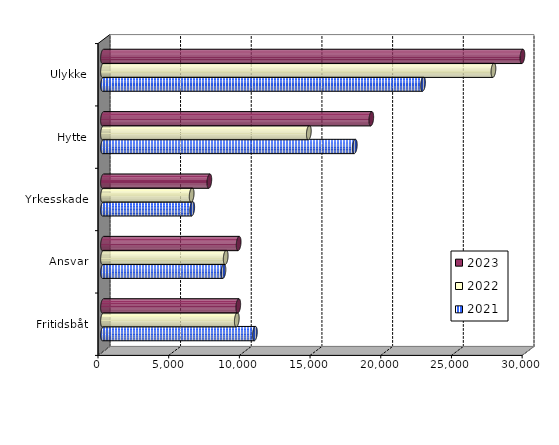
| Category | 2021 | 2022 | 2023 |
|---|---|---|---|
| Fritidsbåt | 10743.278 | 9463.556 | 9566.769 |
| Ansvar | 8518.846 | 8678.91 | 9594.267 |
| Yrkesskade | 6310.199 | 6270.612 | 7520.99 |
| Hytte | 17809.5 | 14558.442 | 18974.892 |
| Ulykke | 22635.92 | 27615.32 | 29665.095 |